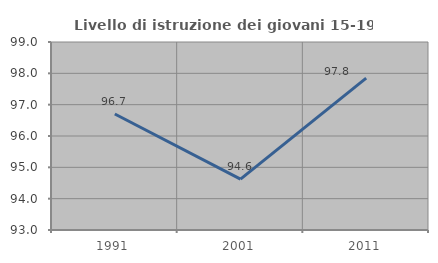
| Category | Livello di istruzione dei giovani 15-19 anni |
|---|---|
| 1991.0 | 96.703 |
| 2001.0 | 94.624 |
| 2011.0 | 97.849 |